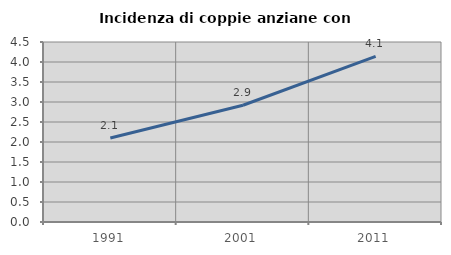
| Category | Incidenza di coppie anziane con figli |
|---|---|
| 1991.0 | 2.099 |
| 2001.0 | 2.919 |
| 2011.0 | 4.139 |